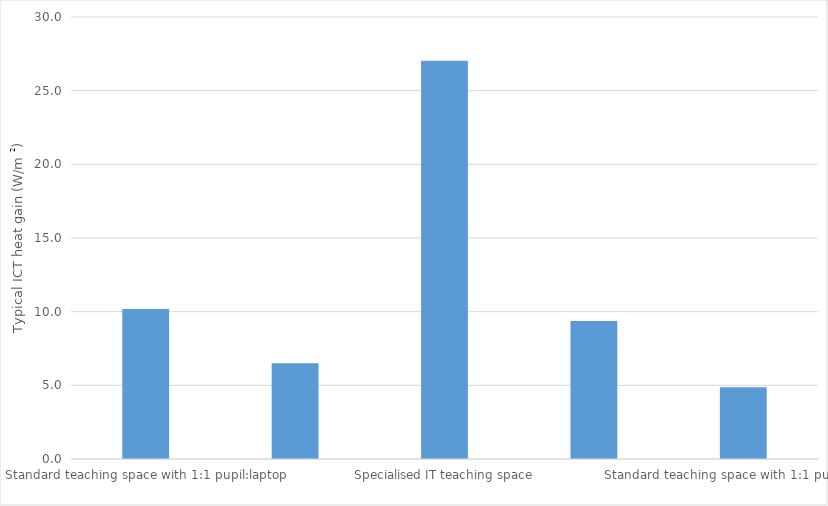
| Category | Series 0 |
|---|---|
| Standard teaching space with 1:1 pupil:laptop | 10.182 |
| Standard teaching space with 2:1 pupil:laptop | 6.5 |
| Specialised IT teaching space | 27.024 |
| Specialised teaching space (e.g. art, music, etc.) with 2:1 pupil:mac | 9.367 |
| Standard teaching space with 1:1 pupil:tablet | 4.864 |